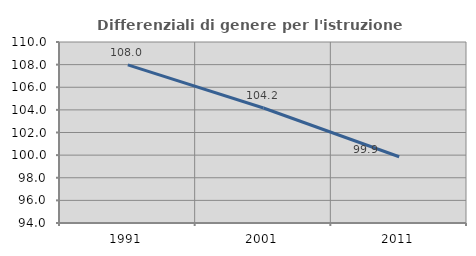
| Category | Differenziali di genere per l'istruzione superiore |
|---|---|
| 1991.0 | 107.972 |
| 2001.0 | 104.165 |
| 2011.0 | 99.855 |